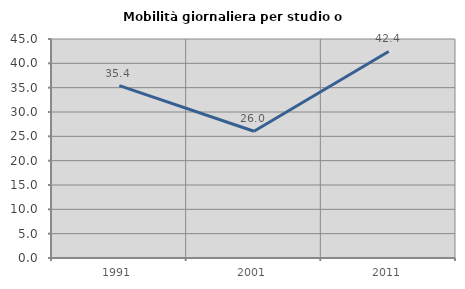
| Category | Mobilità giornaliera per studio o lavoro |
|---|---|
| 1991.0 | 35.41 |
| 2001.0 | 26.047 |
| 2011.0 | 42.448 |